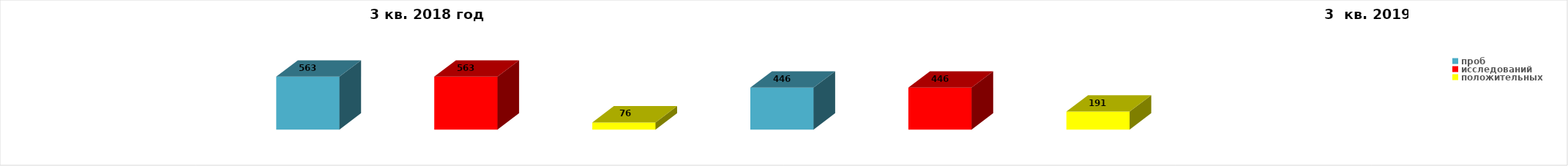
| Category | Series 4 |
|---|---|
| проб | 563 |
| исследований | 563 |
| положительных | 76 |
| проб | 446 |
| исследований | 446 |
| положительных | 191 |